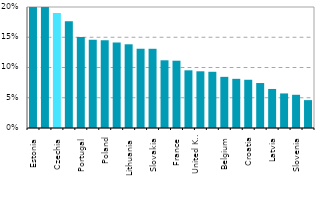
| Category | Series 0 |
|---|---|
| Estonia | 0.355 |
| Bulgaria | 0.321 |
| Czechia | 0.19 |
| Ireland | 0.177 |
| Portugal | 0.15 |
| Greece | 0.146 |
| Poland | 0.145 |
| Finland | 0.141 |
| Lithuania | 0.138 |
| Romania | 0.131 |
| Slovakia | 0.131 |
| Spain | 0.112 |
| France | 0.111 |
| Hungary | 0.095 |
| United Kingdom | 0.094 |
| Netherlands | 0.093 |
| Belgium | 0.085 |
| Italy | 0.081 |
| Croatia | 0.08 |
| Denmark | 0.074 |
| Latvia | 0.065 |
| Austria | 0.057 |
| Slovenia | 0.055 |
| Germany | 0.046 |